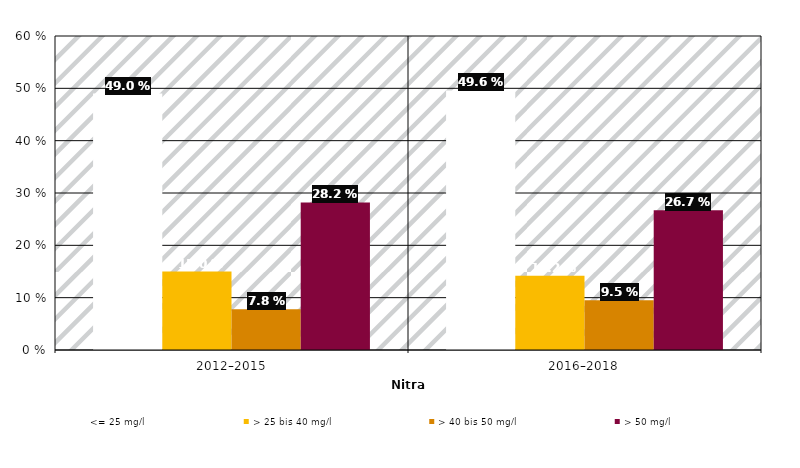
| Category | <= 25 mg/l | > 25 bis 40 mg/l | > 40 bis 50 mg/l | > 50 mg/l |
|---|---|---|---|---|
| 2012–2015 | 0.49 | 0.15 | 0.078 | 0.282 |
| 2016–2018 | 0.496 | 0.142 | 0.095 | 0.267 |